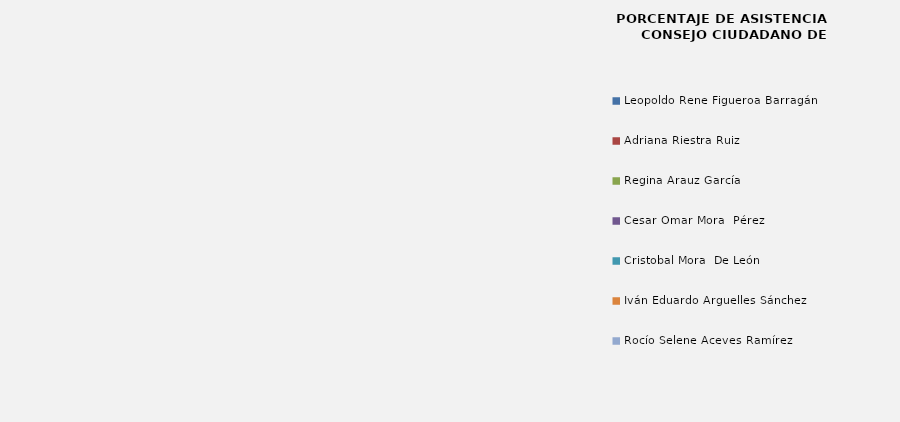
| Category | Series 0 |
|---|---|
| Leopoldo Rene Figueroa Barragán | 0 |
| Adriana Riestra Ruiz | 0 |
| Regina Arauz García | 0 |
| Cesar Omar Mora  Pérez | 0 |
| Cristobal Mora  De León | 0 |
| Iván Eduardo Arguelles Sánchez | 0 |
| Rocío Selene Aceves Ramírez | 0 |